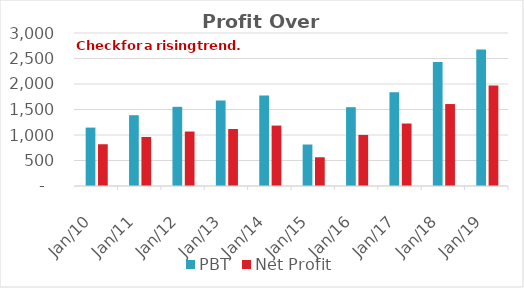
| Category | PBT | Net Profit |
|---|---|---|
| 2010-12-31 | 1145.11 | 818.67 |
| 2011-12-31 | 1387.92 | 961.55 |
| 2012-12-31 | 1552.62 | 1067.93 |
| 2013-12-31 | 1678.02 | 1117.13 |
| 2014-12-31 | 1774.35 | 1184.69 |
| 2015-12-31 | 813.63 | 563.27 |
| 2016-12-31 | 1545.38 | 1001.36 |
| 2017-12-31 | 1839.3 | 1225.19 |
| 2018-12-31 | 2428.95 | 1606.93 |
| 2019-12-31 | 2674.99 | 1969.55 |